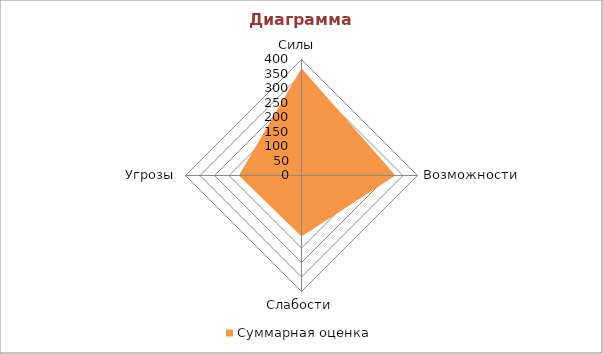
| Category | Суммарная оценка |
|---|---|
| Силы  | 370 |
| Возможности | 324 |
| Слабости | 210.38 |
| Угрозы | 216.12 |